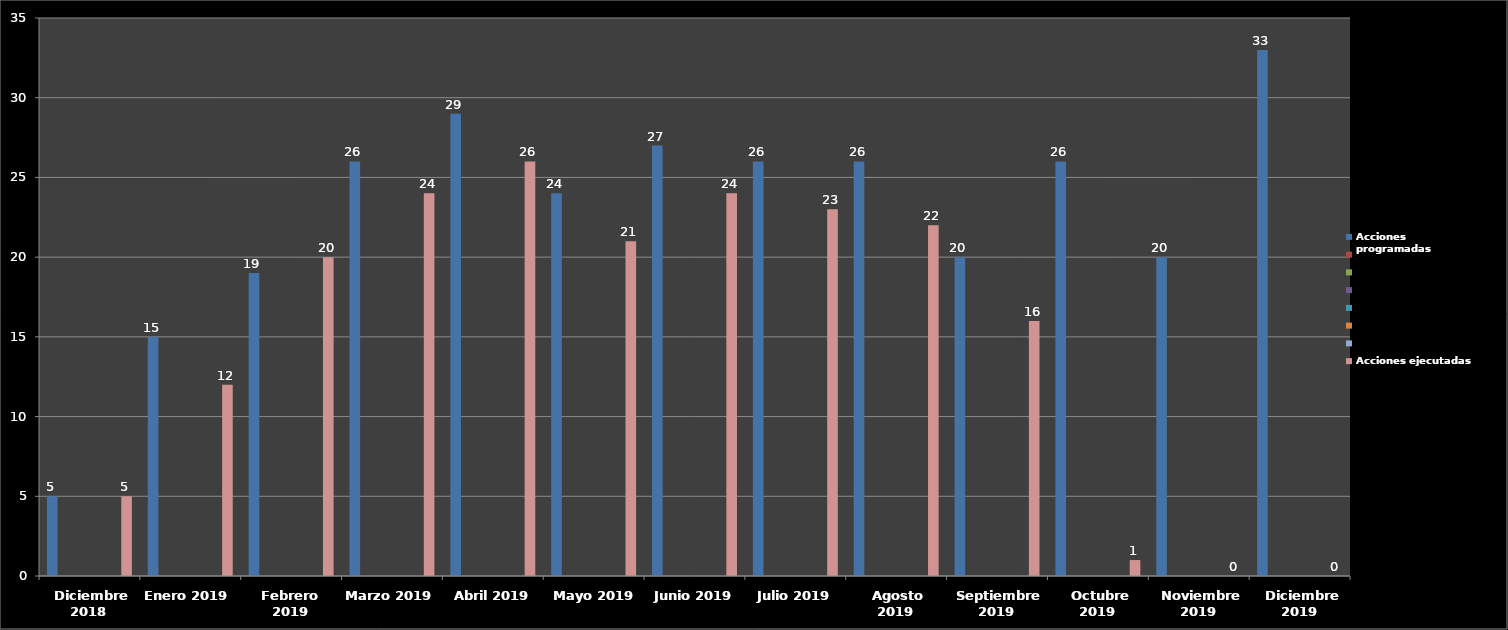
| Category | Acciones programadas | Series 1 | Series 2 | Series 3 | Series 4 | Series 5 | Series 6 | Acciones ejecutadas |
|---|---|---|---|---|---|---|---|---|
| 0 | 5 |  |  |  |  |  |  | 5 |
| 1 | 15 |  |  |  |  |  |  | 12 |
| 2 | 19 |  |  |  |  |  |  | 20 |
| 3 | 26 |  |  |  |  |  |  | 24 |
| 4 | 29 |  |  |  |  |  |  | 26 |
| 5 | 24 |  |  |  |  |  |  | 21 |
| 6 | 27 |  |  |  |  |  |  | 24 |
| 7 | 26 |  |  |  |  |  |  | 23 |
| 8 | 26 |  |  |  |  |  |  | 22 |
| 9 | 20 |  |  |  |  |  |  | 16 |
| 10 | 26 |  |  |  |  |  |  | 1 |
| 11 | 20 |  |  |  |  |  |  | 0 |
| 12 | 33 |  |  |  |  |  |  | 0 |